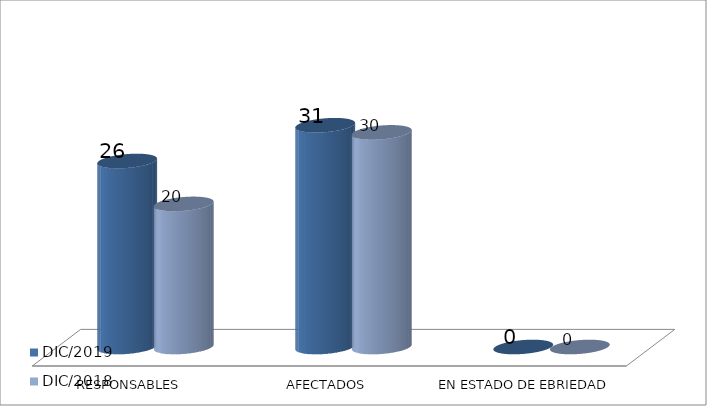
| Category | DIC/2019 | DIC/2018 |
|---|---|---|
| RESPONSABLES | 26 | 20 |
| AFECTADOS | 31 | 30 |
| EN ESTADO DE EBRIEDAD | 0 | 0 |